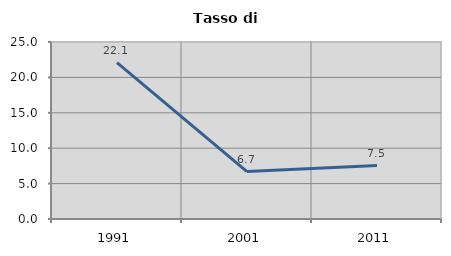
| Category | Tasso di disoccupazione   |
|---|---|
| 1991.0 | 22.091 |
| 2001.0 | 6.695 |
| 2011.0 | 7.54 |